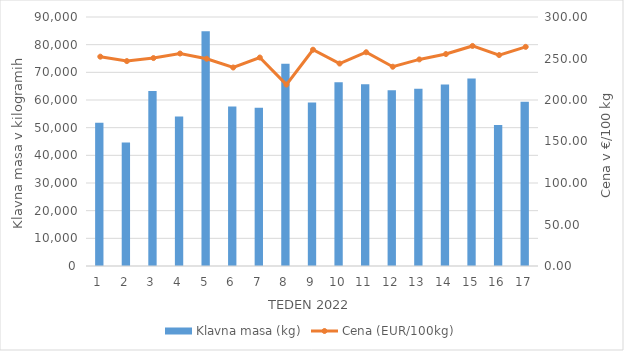
| Category | Klavna masa (kg) |
|---|---|
| 1.0 | 51818 |
| 2.0 | 44619 |
| 3.0 | 63233 |
| 4.0 | 53993 |
| 5.0 | 84871 |
| 6.0 | 57648 |
| 7.0 | 57159 |
| 8.0 | 73139 |
| 9.0 | 59056 |
| 10.0 | 66417 |
| 11.0 | 65723 |
| 12.0 | 63530 |
| 13.0 | 64069 |
| 14.0 | 65564 |
| 15.0 | 67787 |
| 16.0 | 50958 |
| 17.0 | 59387 |